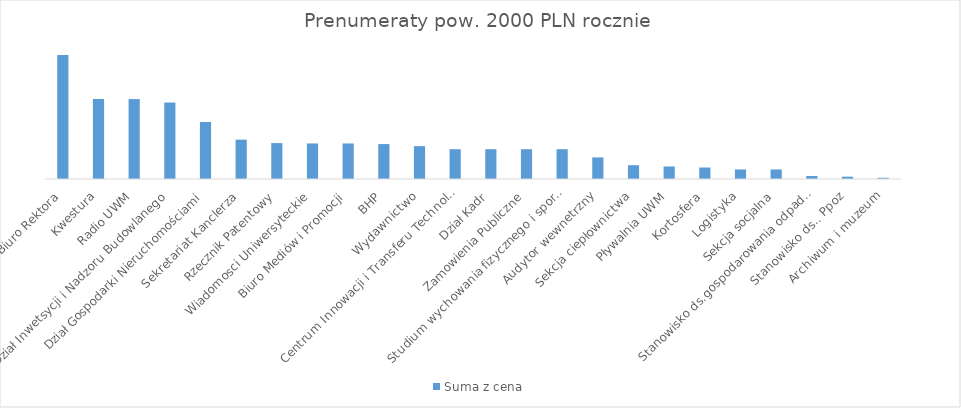
| Category | Suma |
|---|---|
| Biuro Rektora | 8915.64 |
| Kwestura | 5754.38 |
| Radio UWM | 5749.92 |
| Dział Inwetsycji i Nadzoru Budowlanego | 5499.88 |
| Dział Gospodarki Nieruchomościami | 4099.74 |
| Sekretariat Kanclerza | 2830.8 |
| Rzecznik Patentowy | 2584 |
| Wiadomosci Uniwersyteckie | 2556.64 |
| Biuro Mediów i Promocji | 2556.64 |
| BHP | 2513.36 |
| Wydawnictwo | 2365.12 |
| Centrum Innowacji i Transferu Technologii | 2143.76 |
| Dział Kadr | 2143.76 |
| Zamowienia Publiczne | 2143.76 |
| Studium wychowania fizycznego i sportu | 2142.44 |
| Audytor wewnetrzny | 1552.43 |
| Sekcja ciepłownictwa | 993.85 |
| Pływalnia UWM | 901.54 |
| Kortosfera | 827.16 |
| Logistyka | 687.04 |
| Sekcja socjalna | 687.04 |
| Stanowisko ds.gospodarowania odpadami | 217.8 |
| Stanowisko ds.. Ppoz | 167.2 |
| Archiwum i muzeum | 88 |